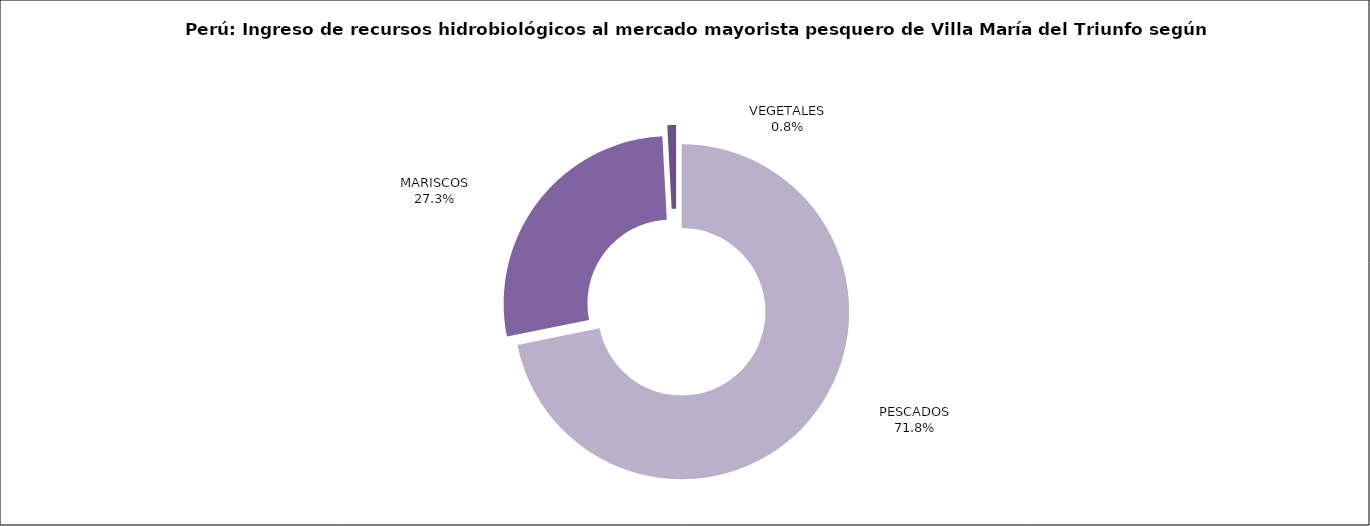
| Category | Series 0 |
|---|---|
| PESCADOS | 59985.448 |
| MARISCOS | 22825.249 |
| VEGETALES | 703.53 |